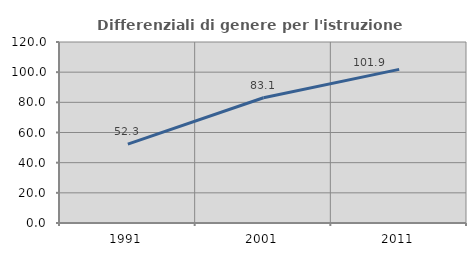
| Category | Differenziali di genere per l'istruzione superiore |
|---|---|
| 1991.0 | 52.299 |
| 2001.0 | 83.058 |
| 2011.0 | 101.869 |